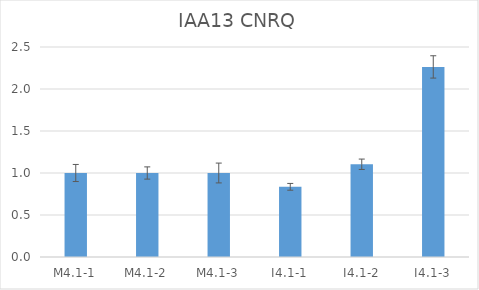
| Category | IAA13 CNRQ |
|---|---|
| M4.1-1 | 1 |
| M4.1-2 | 1 |
| M4.1-3 | 1 |
| I4.1-1 | 0.836 |
| I4.1-2 | 1.104 |
| I4.1-3 | 2.263 |